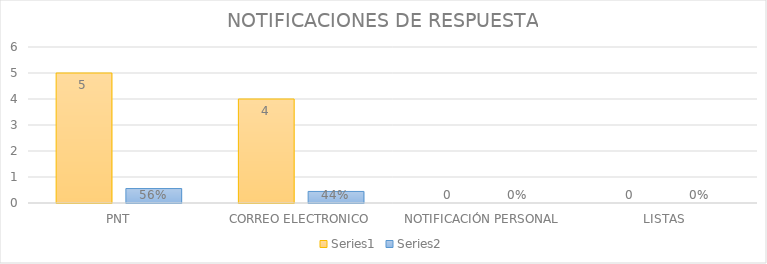
| Category | Series 3 | Series 4 |
|---|---|---|
| PNT | 5 | 0.556 |
| CORREO ELECTRONICO | 4 | 0.444 |
| NOTIFICACIÓN PERSONAL | 0 | 0 |
| LISTAS | 0 | 0 |